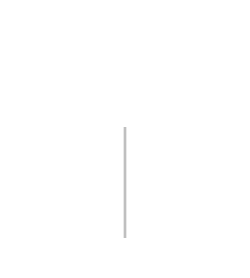
| Category | Positive | Negative |
|---|---|---|
| 0 | 0 | 0 |
| 1 | 3000 | 0 |
| 2 | 3000 | -3000 |